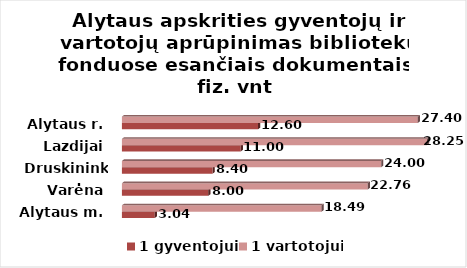
| Category | 1 gyventojui | 1 vartotojui |
|---|---|---|
| Alytaus m. | 3.04 | 18.49 |
| Varėna | 8 | 22.76 |
| Druskininkai | 8.4 | 24 |
| Lazdijai | 11 | 28.25 |
| Alytaus r. | 12.6 | 27.4 |